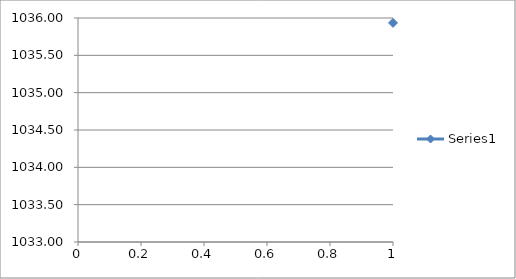
| Category | Series 0 |
|---|---|
| 0 | 1035.934 |
| 1 | 1036.034 |
| 2 | 1035.984 |
| 3 | 1035.884 |
| 4 | 1035.934 |
| 5 | 1035.784 |
| 6 | 1035.784 |
| 7 | 1035.834 |
| 8 | 1035.634 |
| 9 | 1035.584 |
| 10 | 1035.584 |
| 11 | 1035.584 |
| 12 | 1035.534 |
| 13 | 1035.484 |
| 14 | 1035.484 |
| 15 | 1035.584 |
| 16 | 1035.634 |
| 17 | 1035.584 |
| 18 | 1035.684 |
| 19 | 1035.634 |
| 20 | 1035.484 |